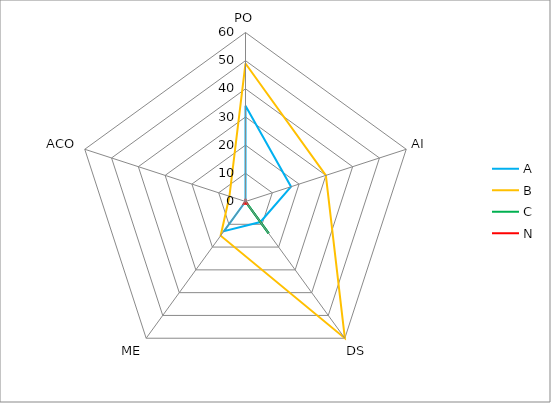
| Category | A | B | C | N |
|---|---|---|---|---|
| 0 | 34 | 49 | 0 | 1 |
| 1 | 17 | 30 | 0 | 0 |
| 2 | 9 | 60 | 14 | 1 |
| 3 | 13 | 15 | 0 | 1 |
| 4 | 0 | 6 | 0 | 0 |